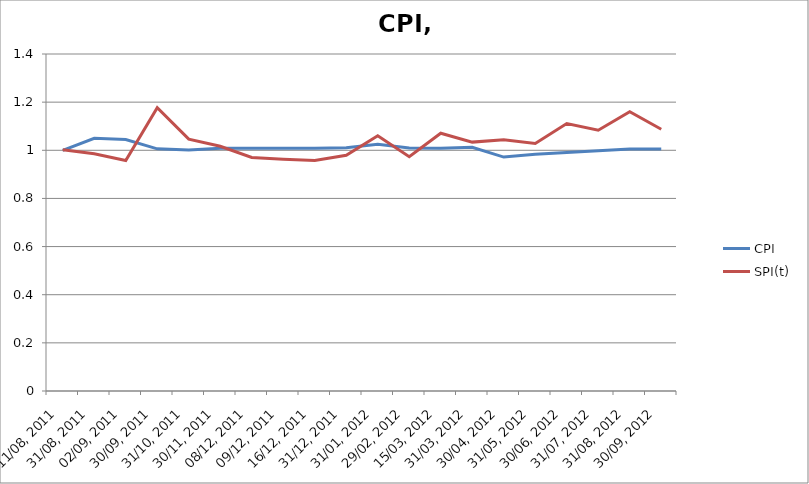
| Category | CPI | SPI(t) |
|---|---|---|
| 11/08, 2011 | 1 | 1.002 |
| 31/08, 2011 | 1.05 | 0.986 |
| 02/09, 2011 | 1.045 | 0.958 |
| 30/09, 2011 | 1.006 | 1.177 |
| 31/10, 2011 | 1.001 | 1.046 |
| 30/11, 2011 | 1.008 | 1.017 |
| 08/12, 2011 | 1.009 | 0.97 |
| 09/12, 2011 | 1.009 | 0.963 |
| 16/12, 2011 | 1.008 | 0.957 |
| 31/12, 2011 | 1.01 | 0.979 |
| 31/01, 2012 | 1.025 | 1.061 |
| 29/02, 2012 | 1.009 | 0.973 |
| 15/03, 2012 | 1.008 | 1.071 |
| 31/03, 2012 | 1.013 | 1.034 |
| 30/04, 2012 | 0.972 | 1.044 |
| 31/05, 2012 | 0.984 | 1.028 |
| 30/06, 2012 | 0.991 | 1.111 |
| 31/07, 2012 | 0.998 | 1.083 |
| 31/08, 2012 | 1.005 | 1.16 |
| 30/09, 2012 | 1.005 | 1.088 |